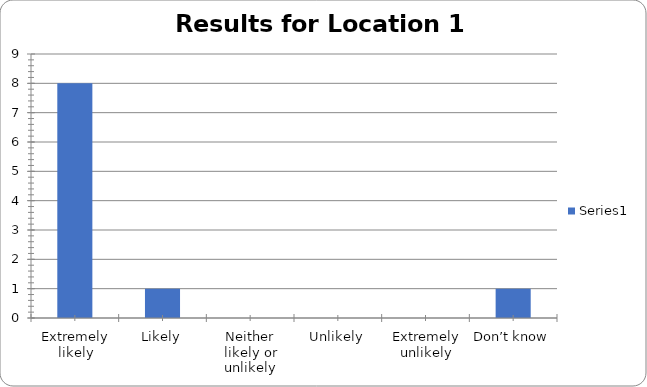
| Category | Series 0 |
|---|---|
| Extremely likely | 8 |
| Likely | 1 |
| Neither likely or unlikely | 0 |
| Unlikely | 0 |
| Extremely unlikely | 0 |
| Don’t know | 1 |